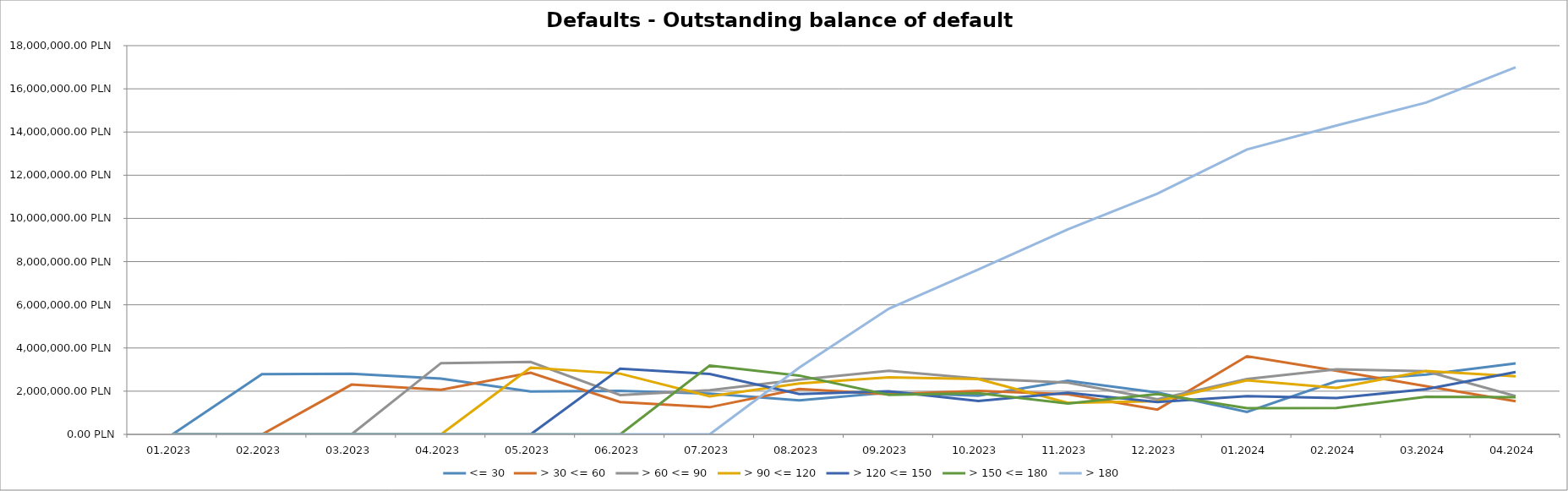
| Category | <= 30 | > 30 <= 60 | > 60 <= 90 | > 90 <= 120 | > 120 <= 150 | > 150 <= 180 | > 180 |
|---|---|---|---|---|---|---|---|
| 01.2023 | 0 | 0 | 0 | 0 | 0 | 0 | 0 |
| 02.2023 | 2788519.82 | 0 | 0 | 0 | 0 | 0 | 0 |
| 03.2023 | 2811517.14 | 2305154.07 | 0 | 0 | 0 | 0 | 0 |
| 04.2023 | 2584791.3 | 2064675.87 | 3301101.31 | 0 | 0 | 0 | 0 |
| 05.2023 | 1985441.56 | 2858398.5 | 3353485.78 | 3091988.77 | 0 | 0 | 0 |
| 06.2023 | 2016845.02 | 1496657.8 | 1822162.63 | 2812422.86 | 3037767.68 | 0 | 0 |
| 07.2023 | 1886118.05 | 1257979.4 | 2047168.21 | 1762916.26 | 2793763.11 | 3184053.47 | 0 |
| 08.2023 | 1572650.17 | 2099798.77 | 2534461.69 | 2357426.74 | 1871124.51 | 2723545.23 | 3093972.9 |
| 09.2023 | 1936023.84 | 1858916.55 | 2940706.37 | 2644290.89 | 1991761.95 | 1826544.8 | 5816448.05 |
| 10.2023 | 1787856.09 | 2019010.42 | 2585069.36 | 2560620.78 | 1548143.78 | 1909160.81 | 7632122.35 |
| 11.2023 | 2487439.47 | 1854213.59 | 2398255.83 | 1460739.8 | 1923073.63 | 1431220.99 | 9496137.88 |
| 12.2023 | 1933713.74 | 1149222.92 | 1628673.09 | 1540023.57 | 1499486.96 | 1871239.58 | 11143858.33 |
| 01.2024 | 1036575.14 | 3616872.94 | 2560909.55 | 2500120.14 | 1769512.28 | 1214846.09 | 13190834.36 |
| 02.2024 | 2461927.54 | 2941651.28 | 3011992.92 | 2150507.7 | 1685298.78 | 1226154.1 | 14300020.03 |
| 03.2024 | 2767540.03 | 2228274.58 | 2922626.54 | 2934675.45 | 2096645.26 | 1743790.31 | 15362743.97 |
| 04.2024 | 3286345.38 | 1533958.51 | 1773160.19 | 2688284.31 | 2886597.98 | 1722153.11 | 16995434.91 |